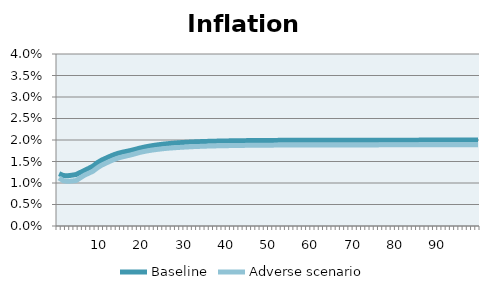
| Category | Baseline | Adverse scenario |
|---|---|---|
| nan | 0.012 | 0.011 |
| nan | 0.012 | 0.011 |
| nan | 0.012 | 0.01 |
| nan | 0.012 | 0.01 |
| nan | 0.012 | 0.011 |
| nan | 0.012 | 0.011 |
| nan | 0.013 | 0.012 |
| nan | 0.013 | 0.012 |
| nan | 0.014 | 0.013 |
| nan | 0.015 | 0.014 |
| 10.0 | 0.015 | 0.014 |
| nan | 0.016 | 0.015 |
| nan | 0.016 | 0.015 |
| nan | 0.017 | 0.015 |
| nan | 0.017 | 0.016 |
| nan | 0.017 | 0.016 |
| nan | 0.017 | 0.016 |
| nan | 0.018 | 0.017 |
| nan | 0.018 | 0.017 |
| nan | 0.018 | 0.017 |
| 20.0 | 0.018 | 0.017 |
| nan | 0.019 | 0.018 |
| nan | 0.019 | 0.018 |
| nan | 0.019 | 0.018 |
| nan | 0.019 | 0.018 |
| nan | 0.019 | 0.018 |
| nan | 0.019 | 0.018 |
| nan | 0.019 | 0.018 |
| nan | 0.019 | 0.018 |
| nan | 0.019 | 0.018 |
| 30.0 | 0.019 | 0.018 |
| nan | 0.02 | 0.018 |
| nan | 0.02 | 0.018 |
| nan | 0.02 | 0.019 |
| nan | 0.02 | 0.019 |
| nan | 0.02 | 0.019 |
| nan | 0.02 | 0.019 |
| nan | 0.02 | 0.019 |
| nan | 0.02 | 0.019 |
| nan | 0.02 | 0.019 |
| 40.0 | 0.02 | 0.019 |
| nan | 0.02 | 0.019 |
| nan | 0.02 | 0.019 |
| nan | 0.02 | 0.019 |
| nan | 0.02 | 0.019 |
| nan | 0.02 | 0.019 |
| nan | 0.02 | 0.019 |
| nan | 0.02 | 0.019 |
| nan | 0.02 | 0.019 |
| nan | 0.02 | 0.019 |
| 50.0 | 0.02 | 0.019 |
| nan | 0.02 | 0.019 |
| nan | 0.02 | 0.019 |
| nan | 0.02 | 0.019 |
| nan | 0.02 | 0.019 |
| nan | 0.02 | 0.019 |
| nan | 0.02 | 0.019 |
| nan | 0.02 | 0.019 |
| nan | 0.02 | 0.019 |
| nan | 0.02 | 0.019 |
| 60.0 | 0.02 | 0.019 |
| nan | 0.02 | 0.019 |
| nan | 0.02 | 0.019 |
| nan | 0.02 | 0.019 |
| nan | 0.02 | 0.019 |
| nan | 0.02 | 0.019 |
| nan | 0.02 | 0.019 |
| nan | 0.02 | 0.019 |
| nan | 0.02 | 0.019 |
| nan | 0.02 | 0.019 |
| 70.0 | 0.02 | 0.019 |
| nan | 0.02 | 0.019 |
| nan | 0.02 | 0.019 |
| nan | 0.02 | 0.019 |
| nan | 0.02 | 0.019 |
| nan | 0.02 | 0.019 |
| nan | 0.02 | 0.019 |
| nan | 0.02 | 0.019 |
| nan | 0.02 | 0.019 |
| nan | 0.02 | 0.019 |
| 80.0 | 0.02 | 0.019 |
| nan | 0.02 | 0.019 |
| nan | 0.02 | 0.019 |
| nan | 0.02 | 0.019 |
| nan | 0.02 | 0.019 |
| nan | 0.02 | 0.019 |
| nan | 0.02 | 0.019 |
| nan | 0.02 | 0.019 |
| nan | 0.02 | 0.019 |
| nan | 0.02 | 0.019 |
| 90.0 | 0.02 | 0.019 |
| nan | 0.02 | 0.019 |
| nan | 0.02 | 0.019 |
| nan | 0.02 | 0.019 |
| nan | 0.02 | 0.019 |
| nan | 0.02 | 0.019 |
| nan | 0.02 | 0.019 |
| nan | 0.02 | 0.019 |
| nan | 0.02 | 0.019 |
| nan | 0.02 | 0.019 |